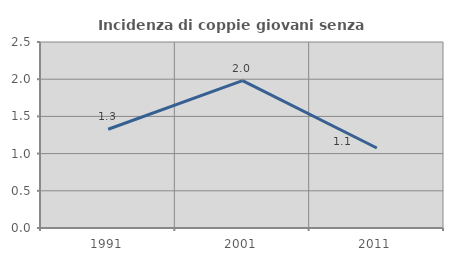
| Category | Incidenza di coppie giovani senza figli |
|---|---|
| 1991.0 | 1.327 |
| 2001.0 | 1.98 |
| 2011.0 | 1.075 |